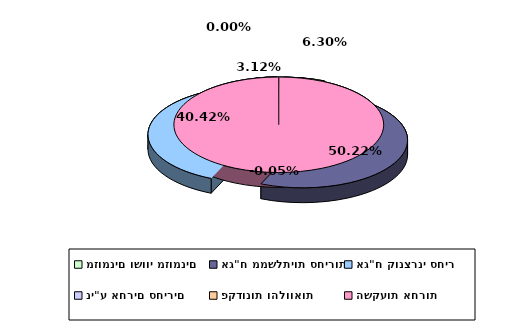
| Category | Series 0 |
|---|---|
| מזומנים ושווי מזומנים | 0.063 |
| אג"ח ממשלתיות סחירות | 0.502 |
| אג"ח קונצרני סחיר | 0.404 |
| ני"ע אחרים סחירים | 0.031 |
| פקדונות והלוואות | 0 |
| השקעות אחרות | -0.001 |